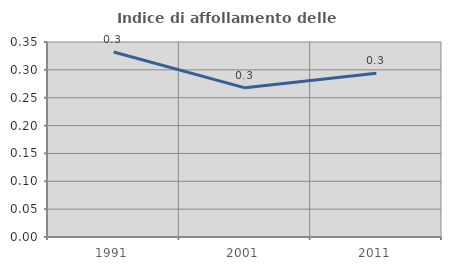
| Category | Indice di affollamento delle abitazioni  |
|---|---|
| 1991.0 | 0.332 |
| 2001.0 | 0.268 |
| 2011.0 | 0.294 |